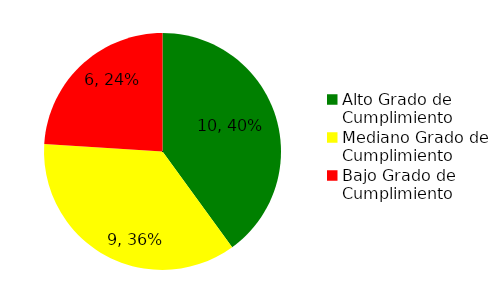
| Category | Series 0 |
|---|---|
| Alto Grado de Cumplimiento | 10 |
| Mediano Grado de Cumplimiento | 9 |
| Bajo Grado de Cumplimiento | 6 |